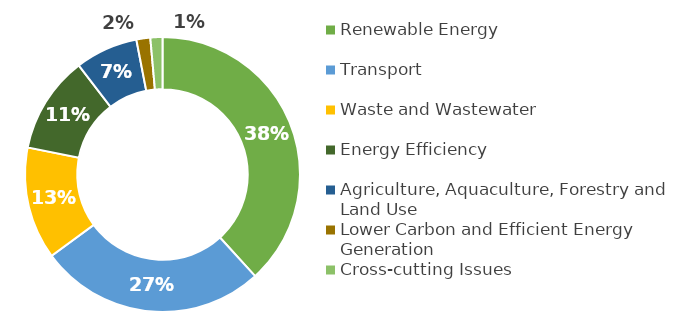
| Category | Series 0 |
|---|---|
| Renewable Energy | 1311124126.946 |
| Transport | 915254020.95 |
| Waste and Wastewater | 453586731.75 |
| Energy Efficiency | 391497585.8 |
| Agriculture, Aquaculture, Forestry and Land Use | 252899467.36 |
| Lower Carbon and Efficient Energy Generation | 55953000 |
| Cross-cutting Issues | 48519726.737 |